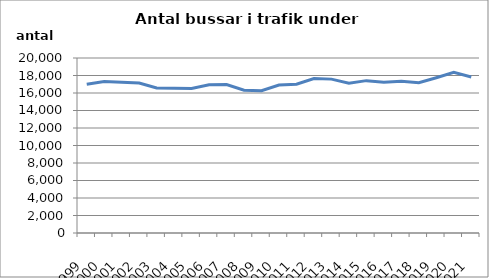
| Category | Series 0 |
|---|---|
| 1999.0 | 17007 |
| 2000.0 | 17315 |
| 2001.0 | 17215 |
| 2002.0 | 17142 |
| 2003.0 | 16564 |
| 2004.0 | 16533 |
| 2005.0 | 16509 |
| 2006.0 | 16934 |
| 2007.0 | 16975 |
| 2008.0 | 16311 |
| 2009.0 | 16253 |
| 2010.0 | 16910 |
| 2011.0 | 17005 |
| 2012.0 | 17655 |
| 2013.0 | 17586 |
| 2014.0 | 17105 |
| 2015.0 | 17413 |
| 2016.0 | 17240 |
| 2017.0 | 17337 |
| 2018.0 | 17172 |
| 2019.0 | 17750 |
| 2020.0 | 18357 |
| 2021.0 | 17837 |